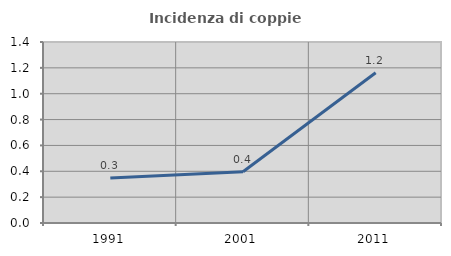
| Category | Incidenza di coppie miste |
|---|---|
| 1991.0 | 0.347 |
| 2001.0 | 0.397 |
| 2011.0 | 1.162 |